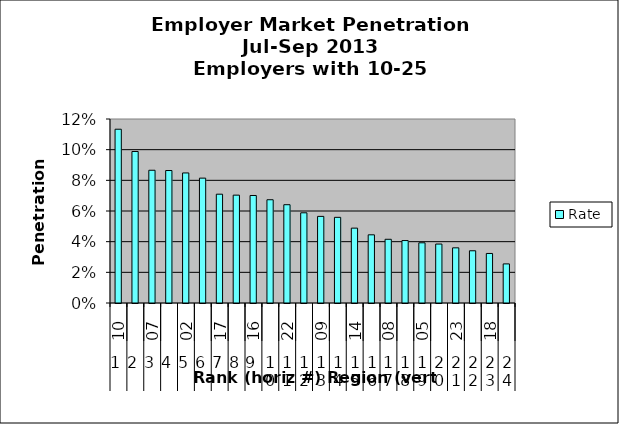
| Category | Rate |
|---|---|
| 0 | 0.113 |
| 1 | 0.099 |
| 2 | 0.087 |
| 3 | 0.086 |
| 4 | 0.085 |
| 5 | 0.081 |
| 6 | 0.071 |
| 7 | 0.07 |
| 8 | 0.07 |
| 9 | 0.067 |
| 10 | 0.064 |
| 11 | 0.059 |
| 12 | 0.056 |
| 13 | 0.056 |
| 14 | 0.049 |
| 15 | 0.044 |
| 16 | 0.042 |
| 17 | 0.041 |
| 18 | 0.039 |
| 19 | 0.038 |
| 20 | 0.036 |
| 21 | 0.034 |
| 22 | 0.032 |
| 23 | 0.026 |